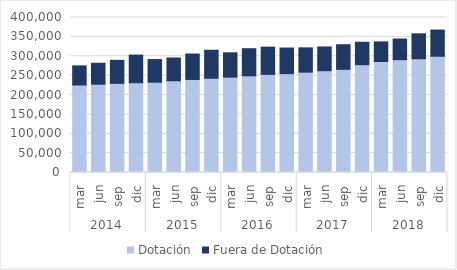
| Category | Dotación | Fuera de Dotación |
|---|---|---|
| 0 | 225803 | 49424 |
| 1 | 227869 | 54117 |
| 2 | 229965 | 59423 |
| 3 | 231717 | 71272 |
| 4 | 232994 | 58506 |
| 5 | 236736 | 58730 |
| 6 | 240114 | 65615 |
| 7 | 243172 | 72383 |
| 8 | 246085 | 62747 |
| 9 | 249595 | 69905 |
| 10 | 253259 | 70209 |
| 11 | 255155 | 66058 |
| 12 | 259006 | 62673 |
| 13 | 262753 | 61278 |
| 14 | 266223 | 63565 |
| 15 | 278254 | 57871 |
| 16 | 286481 | 50572 |
| 17 | 291132 | 53336 |
| 18 | 293531 | 64376 |
| 19 | 299992 | 67590 |